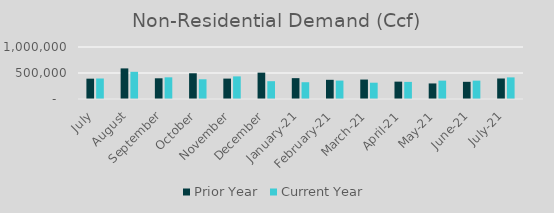
| Category | Prior Year | Current Year |
|---|---|---|
| July | 390975.65 | 394304.316 |
| August | 588468.22 | 522963.473 |
| September | 398263 | 416886.629 |
| October | 494775 | 379515 |
| November | 392357 | 434815 |
| December | 507022 | 342584.594 |
| January-21 | 400923.849 | 322657.16 |
| February-21 | 369131.684 | 354041 |
| March-21 | 374117 | 313343 |
| April-21 | 333800.488 | 329084.722 |
| May-21 | 299245.56 | 353085 |
| June-21 | 330441.187 | 353141.442 |
| July-21 | 394304.316 | 415604.65 |